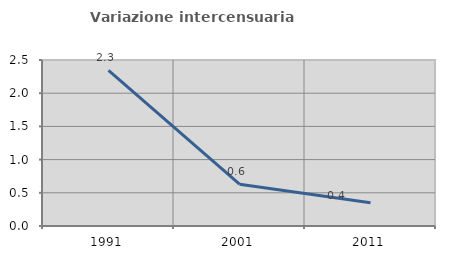
| Category | Variazione intercensuaria annua |
|---|---|
| 1991.0 | 2.345 |
| 2001.0 | 0.63 |
| 2011.0 | 0.35 |